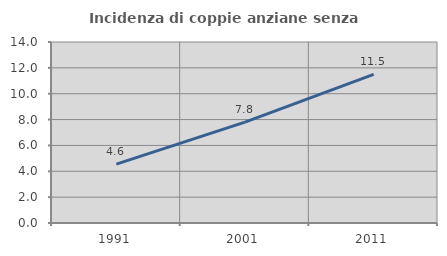
| Category | Incidenza di coppie anziane senza figli  |
|---|---|
| 1991.0 | 4.552 |
| 2001.0 | 7.805 |
| 2011.0 | 11.494 |